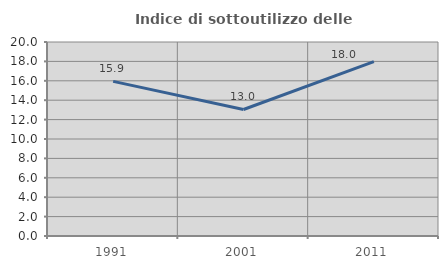
| Category | Indice di sottoutilizzo delle abitazioni  |
|---|---|
| 1991.0 | 15.942 |
| 2001.0 | 13.043 |
| 2011.0 | 17.969 |